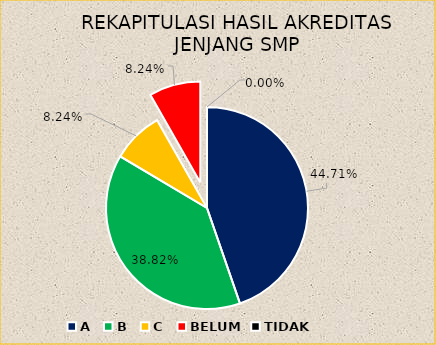
| Category | REKAPITULASI HASIL AKREDITASI JENJANG SMP |
|---|---|
| A | 38 |
| B | 33 |
| C | 7 |
| BELUM | 7 |
| TIDAK | 0 |